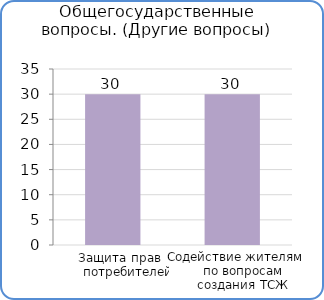
| Category | Расходы |
|---|---|
| Защита прав потребителей | 30000 |
| Содействие жителям по вопросам создания ТСЖ | 30000 |